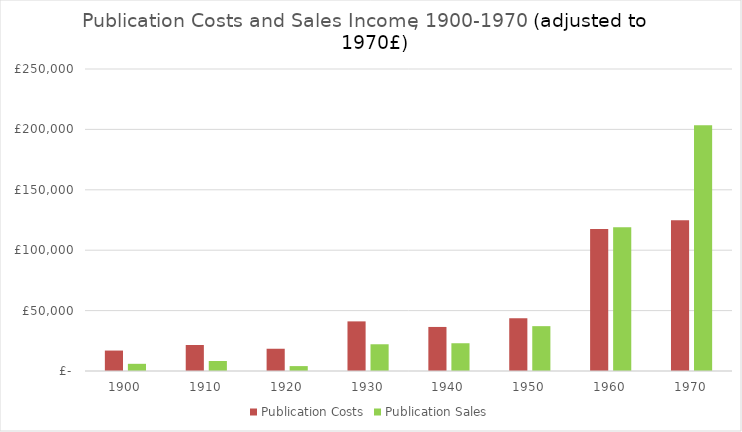
| Category | Publication Costs | Publication Sales |
|---|---|---|
| 1900.0 | 16923.943 | 5944.424 |
| 1910.0 | 21511.716 | 8286.778 |
| 1920.0 | 18422.628 | 4057.819 |
| 1930.0 | 41073.473 | 22130.668 |
| 1940.0 | 36468.848 | 22978.559 |
| 1950.0 | 43668.869 | 37128.012 |
| 1960.0 | 117573.211 | 119058.829 |
| 1970.0 | 124783 | 203362 |